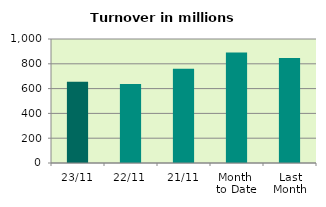
| Category | Series 0 |
|---|---|
| 23/11 | 656.004 |
| 22/11 | 636.191 |
| 21/11 | 760.184 |
| Month 
to Date | 890.496 |
| Last
Month | 847.422 |